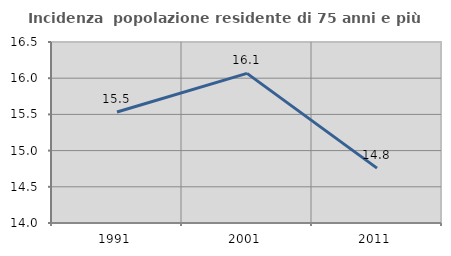
| Category | Incidenza  popolazione residente di 75 anni e più |
|---|---|
| 1991.0 | 15.533 |
| 2001.0 | 16.067 |
| 2011.0 | 14.758 |